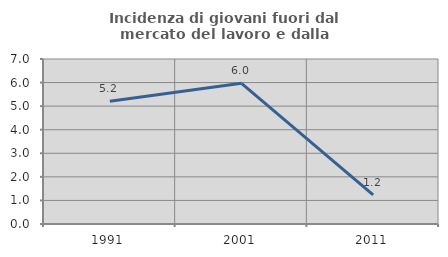
| Category | Incidenza di giovani fuori dal mercato del lavoro e dalla formazione  |
|---|---|
| 1991.0 | 5.208 |
| 2001.0 | 5.97 |
| 2011.0 | 1.235 |